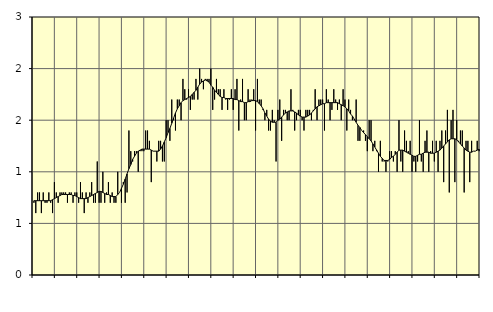
| Category | Piggar | Anställda utomlands |
|---|---|---|
| nan | 0.7 | 0.72 |
| 1.0 | 0.6 | 0.72 |
| 1.0 | 0.8 | 0.72 |
| 1.0 | 0.8 | 0.72 |
| 1.0 | 0.6 | 0.72 |
| 1.0 | 0.8 | 0.72 |
| 1.0 | 0.7 | 0.72 |
| 1.0 | 0.7 | 0.72 |
| 1.0 | 0.8 | 0.72 |
| 1.0 | 0.7 | 0.72 |
| 1.0 | 0.6 | 0.73 |
| 1.0 | 0.9 | 0.74 |
| nan | 0.8 | 0.75 |
| 2.0 | 0.7 | 0.76 |
| 2.0 | 0.8 | 0.77 |
| 2.0 | 0.8 | 0.78 |
| 2.0 | 0.8 | 0.78 |
| 2.0 | 0.8 | 0.78 |
| 2.0 | 0.7 | 0.78 |
| 2.0 | 0.8 | 0.78 |
| 2.0 | 0.8 | 0.78 |
| 2.0 | 0.7 | 0.77 |
| 2.0 | 0.8 | 0.77 |
| 2.0 | 0.8 | 0.76 |
| nan | 0.7 | 0.75 |
| 3.0 | 0.9 | 0.74 |
| 3.0 | 0.8 | 0.74 |
| 3.0 | 0.6 | 0.74 |
| 3.0 | 0.8 | 0.74 |
| 3.0 | 0.7 | 0.75 |
| 3.0 | 0.8 | 0.76 |
| 3.0 | 0.9 | 0.77 |
| 3.0 | 0.7 | 0.78 |
| 3.0 | 0.7 | 0.79 |
| 3.0 | 1.1 | 0.8 |
| 3.0 | 0.7 | 0.81 |
| nan | 0.7 | 0.81 |
| 4.0 | 1 | 0.8 |
| 4.0 | 0.7 | 0.79 |
| 4.0 | 0.8 | 0.78 |
| 4.0 | 0.9 | 0.78 |
| 4.0 | 0.7 | 0.77 |
| 4.0 | 0.8 | 0.76 |
| 4.0 | 0.7 | 0.76 |
| 4.0 | 0.7 | 0.76 |
| 4.0 | 1 | 0.78 |
| 4.0 | 0.8 | 0.8 |
| 4.0 | 0.7 | 0.84 |
| nan | 0.9 | 0.88 |
| 5.0 | 0.7 | 0.93 |
| 5.0 | 0.8 | 0.98 |
| 5.0 | 1.4 | 1.03 |
| 5.0 | 1.2 | 1.07 |
| 5.0 | 1.1 | 1.12 |
| 5.0 | 1.2 | 1.15 |
| 5.0 | 1.2 | 1.18 |
| 5.0 | 1 | 1.2 |
| 5.0 | 1.2 | 1.21 |
| 5.0 | 1.2 | 1.22 |
| 5.0 | 1.2 | 1.22 |
| nan | 1.4 | 1.22 |
| 6.0 | 1.4 | 1.22 |
| 6.0 | 1.3 | 1.22 |
| 6.0 | 0.9 | 1.21 |
| 6.0 | 1.2 | 1.2 |
| 6.0 | 1.2 | 1.2 |
| 6.0 | 1.1 | 1.2 |
| 6.0 | 1.3 | 1.2 |
| 6.0 | 1.3 | 1.22 |
| 6.0 | 1.1 | 1.25 |
| 6.0 | 1.1 | 1.29 |
| 6.0 | 1.5 | 1.33 |
| nan | 1.5 | 1.38 |
| 7.0 | 1.3 | 1.42 |
| 7.0 | 1.7 | 1.47 |
| 7.0 | 1.5 | 1.52 |
| 7.0 | 1.4 | 1.57 |
| 7.0 | 1.7 | 1.61 |
| 7.0 | 1.7 | 1.64 |
| 7.0 | 1.5 | 1.67 |
| 7.0 | 1.9 | 1.69 |
| 7.0 | 1.8 | 1.7 |
| 7.0 | 1.7 | 1.71 |
| 7.0 | 1.8 | 1.72 |
| nan | 1.6 | 1.73 |
| 8.0 | 1.7 | 1.75 |
| 8.0 | 1.7 | 1.77 |
| 8.0 | 1.9 | 1.79 |
| 8.0 | 1.7 | 1.82 |
| 8.0 | 2 | 1.85 |
| 8.0 | 1.9 | 1.87 |
| 8.0 | 1.8 | 1.88 |
| 8.0 | 1.9 | 1.89 |
| 8.0 | 1.9 | 1.88 |
| 8.0 | 1.9 | 1.87 |
| 8.0 | 2 | 1.84 |
| nan | 1.6 | 1.82 |
| 9.0 | 1.7 | 1.79 |
| 9.0 | 1.9 | 1.77 |
| 9.0 | 1.8 | 1.75 |
| 9.0 | 1.8 | 1.73 |
| 9.0 | 1.6 | 1.72 |
| 9.0 | 1.8 | 1.72 |
| 9.0 | 1.7 | 1.71 |
| 9.0 | 1.6 | 1.71 |
| 9.0 | 1.7 | 1.71 |
| 9.0 | 1.8 | 1.71 |
| 9.0 | 1.6 | 1.71 |
| nan | 1.8 | 1.7 |
| 10.0 | 1.9 | 1.7 |
| 10.0 | 1.4 | 1.69 |
| 10.0 | 1.7 | 1.68 |
| 10.0 | 1.9 | 1.68 |
| 10.0 | 1.5 | 1.67 |
| 10.0 | 1.5 | 1.67 |
| 10.0 | 1.8 | 1.68 |
| 10.0 | 1.7 | 1.68 |
| 10.0 | 1.7 | 1.69 |
| 10.0 | 1.8 | 1.69 |
| 10.0 | 1.4 | 1.69 |
| nan | 1.9 | 1.68 |
| 11.0 | 1.7 | 1.66 |
| 11.0 | 1.7 | 1.64 |
| 11.0 | 1.6 | 1.61 |
| 11.0 | 1.5 | 1.57 |
| 11.0 | 1.6 | 1.54 |
| 11.0 | 1.4 | 1.51 |
| 11.0 | 1.4 | 1.49 |
| 11.0 | 1.6 | 1.48 |
| 11.0 | 1.5 | 1.48 |
| 11.0 | 1.1 | 1.48 |
| 11.0 | 1.6 | 1.5 |
| nan | 1.7 | 1.51 |
| 12.0 | 1.3 | 1.53 |
| 12.0 | 1.6 | 1.55 |
| 12.0 | 1.6 | 1.57 |
| 12.0 | 1.5 | 1.58 |
| 12.0 | 1.5 | 1.59 |
| 12.0 | 1.8 | 1.59 |
| 12.0 | 1.6 | 1.59 |
| 12.0 | 1.4 | 1.58 |
| 12.0 | 1.5 | 1.57 |
| 12.0 | 1.6 | 1.55 |
| 12.0 | 1.6 | 1.54 |
| nan | 1.5 | 1.53 |
| 13.0 | 1.4 | 1.53 |
| 13.0 | 1.6 | 1.53 |
| 13.0 | 1.6 | 1.54 |
| 13.0 | 1.6 | 1.55 |
| 13.0 | 1.5 | 1.57 |
| 13.0 | 1.6 | 1.59 |
| 13.0 | 1.8 | 1.61 |
| 13.0 | 1.5 | 1.63 |
| 13.0 | 1.7 | 1.64 |
| 13.0 | 1.7 | 1.65 |
| 13.0 | 1.7 | 1.66 |
| nan | 1.4 | 1.66 |
| 14.0 | 1.8 | 1.67 |
| 14.0 | 1.7 | 1.67 |
| 14.0 | 1.5 | 1.67 |
| 14.0 | 1.6 | 1.67 |
| 14.0 | 1.8 | 1.67 |
| 14.0 | 1.7 | 1.67 |
| 14.0 | 1.6 | 1.67 |
| 14.0 | 1.7 | 1.66 |
| 14.0 | 1.5 | 1.65 |
| 14.0 | 1.8 | 1.64 |
| 14.0 | 1.7 | 1.63 |
| nan | 1.4 | 1.61 |
| 15.0 | 1.7 | 1.59 |
| 15.0 | 1.6 | 1.56 |
| 15.0 | 1.5 | 1.54 |
| 15.0 | 1.5 | 1.51 |
| 15.0 | 1.7 | 1.48 |
| 15.0 | 1.3 | 1.45 |
| 15.0 | 1.3 | 1.43 |
| 15.0 | 1.4 | 1.4 |
| 15.0 | 1.4 | 1.38 |
| 15.0 | 1.3 | 1.36 |
| 15.0 | 1.2 | 1.34 |
| nan | 1.5 | 1.32 |
| 16.0 | 1.5 | 1.3 |
| 16.0 | 1.2 | 1.27 |
| 16.0 | 1.3 | 1.24 |
| 16.0 | 1.2 | 1.21 |
| 16.0 | 1 | 1.18 |
| 16.0 | 1.3 | 1.15 |
| 16.0 | 1.1 | 1.13 |
| 16.0 | 1.1 | 1.11 |
| 16.0 | 1 | 1.11 |
| 16.0 | 1.1 | 1.11 |
| 16.0 | 1.2 | 1.12 |
| nan | 1.2 | 1.14 |
| 17.0 | 1.1 | 1.15 |
| 17.0 | 1.2 | 1.17 |
| 17.0 | 1 | 1.19 |
| 17.0 | 1.5 | 1.21 |
| 17.0 | 1.1 | 1.21 |
| 17.0 | 1 | 1.21 |
| 17.0 | 1.4 | 1.2 |
| 17.0 | 1.3 | 1.19 |
| 17.0 | 1.2 | 1.18 |
| 17.0 | 1.3 | 1.17 |
| 17.0 | 1 | 1.16 |
| nan | 1.1 | 1.15 |
| 18.0 | 1 | 1.15 |
| 18.0 | 1.1 | 1.16 |
| 18.0 | 1.5 | 1.17 |
| 18.0 | 1.1 | 1.17 |
| 18.0 | 1 | 1.18 |
| 18.0 | 1.3 | 1.19 |
| 18.0 | 1.4 | 1.19 |
| 18.0 | 1 | 1.19 |
| 18.0 | 1.2 | 1.18 |
| 18.0 | 1.3 | 1.18 |
| 18.0 | 1.1 | 1.18 |
| nan | 1.3 | 1.19 |
| 19.0 | 1 | 1.2 |
| 19.0 | 1.3 | 1.21 |
| 19.0 | 1.4 | 1.23 |
| 19.0 | 0.9 | 1.25 |
| 19.0 | 1.4 | 1.27 |
| 19.0 | 1.6 | 1.29 |
| 19.0 | 0.8 | 1.31 |
| 19.0 | 1.5 | 1.32 |
| 19.0 | 1.6 | 1.32 |
| 19.0 | 0.9 | 1.32 |
| 19.0 | 1.5 | 1.31 |
| nan | 1.3 | 1.29 |
| 20.0 | 1.4 | 1.27 |
| 20.0 | 1.4 | 1.25 |
| 20.0 | 0.8 | 1.23 |
| 20.0 | 1.3 | 1.21 |
| 20.0 | 1.3 | 1.2 |
| 20.0 | 0.9 | 1.19 |
| 20.0 | 1.3 | 1.19 |
| 20.0 | 1.2 | 1.2 |
| 20.0 | 1.2 | 1.2 |
| 20.0 | 1.3 | 1.21 |
| 20.0 | 1.2 | 1.22 |